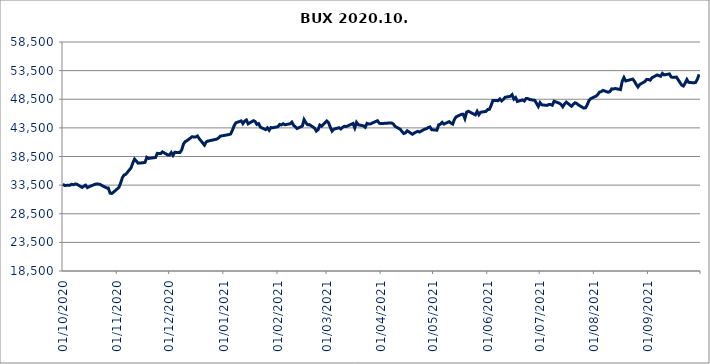
| Category | BUX |
|---|---|
| 01/10/2020 | 33657.71 |
| 02/10/2020 | 33449.84 |
| 05/10/2020 | 33468.11 |
| 06/10/2020 | 33651.55 |
| 07/10/2020 | 33561.05 |
| 08/10/2020 | 33697.94 |
| 09/10/2020 | 33660.44 |
| 12/10/2020 | 33097.01 |
| 13/10/2020 | 33322.71 |
| 14/10/2020 | 33496.67 |
| 15/10/2020 | 33061.27 |
| 16/10/2020 | 33225.15 |
| 19/10/2020 | 33596.79 |
| 20/10/2020 | 33700.78 |
| 21/10/2020 | 33696.73 |
| 22/10/2020 | 33655.1 |
| 26/10/2020 | 33012.62 |
| 27/10/2020 | 32992.69 |
| 28/10/2020 | 32106.78 |
| 29/10/2020 | 32047.68 |
| 30/10/2020 | 32279.17 |
| 02/11/2020 | 33077.55 |
| 03/11/2020 | 33834.43 |
| 04/11/2020 | 34774.72 |
| 05/11/2020 | 35264.98 |
| 06/11/2020 | 35390.44 |
| 09/11/2020 | 36524.01 |
| 10/11/2020 | 37366.63 |
| 11/11/2020 | 38045.8 |
| 12/11/2020 | 37712.82 |
| 13/11/2020 | 37335.1 |
| 16/11/2020 | 37414.6 |
| 17/11/2020 | 37470.5 |
| 18/11/2020 | 38361.82 |
| 19/11/2020 | 38163.61 |
| 20/11/2020 | 38204.67 |
| 23/11/2020 | 38319.06 |
| 24/11/2020 | 39046.5 |
| 25/11/2020 | 39035.1 |
| 26/11/2020 | 39023.56 |
| 27/11/2020 | 39308.9 |
| 30/11/2020 | 38782.16 |
| 01/12/2020 | 38751.98 |
| 02/12/2020 | 39191.11 |
| 03/12/2020 | 38705.12 |
| 04/12/2020 | 39227.87 |
| 07/12/2020 | 39198.31 |
| 08/12/2020 | 39655.97 |
| 09/12/2020 | 40675.89 |
| 10/12/2020 | 41103.01 |
| 11/12/2020 | 41263.67 |
| 14/12/2020 | 41967.89 |
| 15/12/2020 | 41894.09 |
| 16/12/2020 | 41911.27 |
| 17/12/2020 | 42088.03 |
| 18/12/2020 | 41614.92 |
| 21/12/2020 | 40483.17 |
| 22/12/2020 | 41049.52 |
| 23/12/2020 | 41197.14 |
| 28/12/2020 | 41528.44 |
| 29/12/2020 | 41733.11 |
| 30/12/2020 | 42047.586 |
| 04/01/2021 | 42333.48 |
| 05/01/2021 | 42434.3 |
| 06/01/2021 | 43085.06 |
| 07/01/2021 | 43900.7 |
| 08/01/2021 | 44393.21 |
| 11/01/2021 | 44715.79 |
| 12/01/2021 | 44246.56 |
| 13/01/2021 | 44684.36 |
| 14/01/2021 | 44876.42 |
| 15/01/2021 | 44204.45 |
| 18/01/2021 | 44755.59 |
| 19/01/2021 | 44610 |
| 20/01/2021 | 44103.4 |
| 21/01/2021 | 44250.43 |
| 22/01/2021 | 43630.22 |
| 25/01/2021 | 43188.94 |
| 26/01/2021 | 43507.13 |
| 27/01/2021 | 43077.24 |
| 28/01/2021 | 43552.04 |
| 29/01/2021 | 43517.12 |
| 01/02/2021 | 43703.87 |
| 02/02/2021 | 44101.05 |
| 03/02/2021 | 44016.29 |
| 04/02/2021 | 44226.34 |
| 05/02/2021 | 44045.26 |
| 08/02/2021 | 44215.97 |
| 09/02/2021 | 44511.16 |
| 10/02/2021 | 43950.78 |
| 11/02/2021 | 43676.69 |
| 12/02/2021 | 43389.33 |
| 15/02/2021 | 43823.57 |
| 16/02/2021 | 44941.65 |
| 17/02/2021 | 44416.15 |
| 18/02/2021 | 44046.56 |
| 19/02/2021 | 44069.31 |
| 22/02/2021 | 43457.15 |
| 23/02/2021 | 42945.11 |
| 24/02/2021 | 43183.45 |
| 25/02/2021 | 43999.47 |
| 26/02/2021 | 43790.17 |
| 01/03/2021 | 44710.25 |
| 02/03/2021 | 44402.33 |
| 03/03/2021 | 43595.22 |
| 04/03/2021 | 42932.61 |
| 05/03/2021 | 43269 |
| 08/03/2021 | 43540.36 |
| 09/03/2021 | 43312.66 |
| 10/03/2021 | 43579.39 |
| 11/03/2021 | 43784.89 |
| 12/03/2021 | 43711.84 |
| 16/03/2021 | 44268.77 |
| 17/03/2021 | 43504.47 |
| 18/03/2021 | 44465.75 |
| 19/03/2021 | 44042.12 |
| 22/03/2021 | 43851.96 |
| 23/03/2021 | 43603.02 |
| 24/03/2021 | 44290.24 |
| 25/03/2021 | 44168.81 |
| 26/03/2021 | 44201.25 |
| 29/03/2021 | 44617.73 |
| 30/03/2021 | 44746.76 |
| 31/03/2021 | 44326.18 |
| 01/04/2021 | 44242.93 |
| 06/04/2021 | 44357.86 |
| 07/04/2021 | 44357.64 |
| 08/04/2021 | 44194.16 |
| 09/04/2021 | 43775.41 |
| 12/04/2021 | 43267.25 |
| 13/04/2021 | 42865.63 |
| 14/04/2021 | 42514.94 |
| 15/04/2021 | 42626.71 |
| 16/04/2021 | 42997.61 |
| 19/04/2021 | 42388.09 |
| 20/04/2021 | 42597.26 |
| 21/04/2021 | 42753.6 |
| 22/04/2021 | 42906.48 |
| 23/04/2021 | 42772.95 |
| 26/04/2021 | 43281.61 |
| 27/04/2021 | 43357.19 |
| 28/04/2021 | 43549.43 |
| 29/04/2021 | 43665.42 |
| 30/04/2021 | 43183.2 |
| 03/05/2021 | 43093.89 |
| 04/05/2021 | 44036.18 |
| 05/05/2021 | 44142.7 |
| 06/05/2021 | 44472.71 |
| 07/05/2021 | 44164.37 |
| 10/05/2021 | 44587.59 |
| 11/05/2021 | 44350.67 |
| 12/05/2021 | 44160.71 |
| 13/05/2021 | 44974.08 |
| 14/05/2021 | 45429.12 |
| 17/05/2021 | 45862.01 |
| 18/05/2021 | 45891.45 |
| 19/05/2021 | 45128.56 |
| 20/05/2021 | 46261.37 |
| 21/05/2021 | 46396.87 |
| 25/05/2021 | 45765.15 |
| 26/05/2021 | 46379.32 |
| 27/05/2021 | 45802.61 |
| 28/05/2021 | 46233.29 |
| 31/05/2021 | 46371.02 |
| 01/06/2021 | 46699.74 |
| 02/06/2021 | 46736.89 |
| 03/06/2021 | 47422.77 |
| 04/06/2021 | 48282.14 |
| 07/06/2021 | 48255.9 |
| 08/06/2021 | 48546.45 |
| 09/06/2021 | 48206.56 |
| 10/06/2021 | 48475.07 |
| 11/06/2021 | 48845.84 |
| 14/06/2021 | 49015.24 |
| 15/06/2021 | 49299.48 |
| 16/06/2021 | 48525.74 |
| 17/06/2021 | 48795.68 |
| 18/06/2021 | 48117.72 |
| 21/06/2021 | 48379.62 |
| 22/06/2021 | 48193.16 |
| 23/06/2021 | 48624.32 |
| 24/06/2021 | 48610.4 |
| 25/06/2021 | 48461.47 |
| 28/06/2021 | 48301.62 |
| 29/06/2021 | 47759.62 |
| 30/06/2021 | 47238.09 |
| 01/07/2021 | 47908.81 |
| 02/07/2021 | 47520.42 |
| 05/07/2021 | 47423.61 |
| 06/07/2021 | 47592.47 |
| 07/07/2021 | 47574.37 |
| 08/07/2021 | 47452.73 |
| 09/07/2021 | 48157.57 |
| 12/07/2021 | 47804.26 |
| 13/07/2021 | 47592.34 |
| 14/07/2021 | 47184.6 |
| 15/07/2021 | 47677.82 |
| 16/07/2021 | 48003.25 |
| 19/07/2021 | 47268.49 |
| 20/07/2021 | 47622.68 |
| 21/07/2021 | 47882.56 |
| 22/07/2021 | 47756.88 |
| 23/07/2021 | 47491.69 |
| 26/07/2021 | 46952.76 |
| 27/07/2021 | 47002.77 |
| 28/07/2021 | 47527.53 |
| 29/07/2021 | 48286.06 |
| 30/07/2021 | 48610.95 |
| 02/08/2021 | 49041.18 |
| 03/08/2021 | 49315.61 |
| 04/08/2021 | 49745.57 |
| 05/08/2021 | 49830.28 |
| 06/08/2021 | 50050.88 |
| 09/08/2021 | 49721.84 |
| 10/08/2021 | 49849.71 |
| 11/08/2021 | 50317.1 |
| 12/08/2021 | 50289.64 |
| 13/08/2021 | 50378.65 |
| 16/08/2021 | 50183.56 |
| 17/08/2021 | 51626.62 |
| 18/08/2021 | 52288.87 |
| 19/08/2021 | 51696.55 |
| 23/08/2021 | 52023.19 |
| 24/08/2021 | 51633.85 |
| 25/08/2021 | 51093.8 |
| 26/08/2021 | 50640.51 |
| 27/08/2021 | 51068.8 |
| 30/08/2021 | 51602.58 |
| 31/08/2021 | 51969.67 |
| 01/09/2021 | 51946.96 |
| 02/09/2021 | 51830.24 |
| 03/09/2021 | 52255.11 |
| 06/09/2021 | 52743.09 |
| 07/09/2021 | 52623.96 |
| 08/09/2021 | 52514.94 |
| 09/09/2021 | 53015.67 |
| 10/09/2021 | 52755.68 |
| 13/09/2021 | 52922.72 |
| 14/09/2021 | 52392.39 |
| 15/09/2021 | 52317.91 |
| 16/09/2021 | 52331.31 |
| 17/09/2021 | 52376.91 |
| 20/09/2021 | 50982.15 |
| 21/09/2021 | 50815.56 |
| 22/09/2021 | 51298.14 |
| 23/09/2021 | 51946.86 |
| 24/09/2021 | 51453.71 |
| 27/09/2021 | 51365.99 |
| 28/09/2021 | 51446.2 |
| 29/09/2021 | 52004.6 |
| 30/09/2021 | 52854.65 |